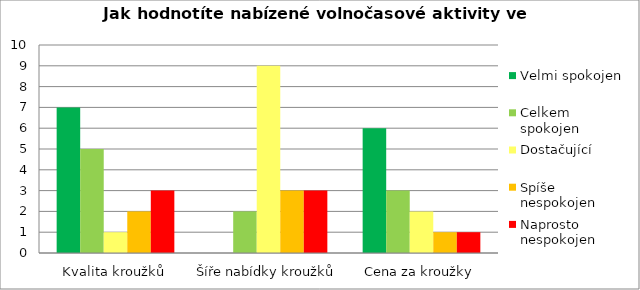
| Category | Velmi spokojen | Celkem 
spokojen | Dostačující | Spíše 
nespokojen | Naprosto 
nespokojen |
|---|---|---|---|---|---|
| Kvalita kroužků | 7 | 5 | 1 | 2 | 3 |
| Šíře nabídky kroužků | 0 | 2 | 9 | 3 | 3 |
| Cena za kroužky | 6 | 3 | 2 | 1 | 1 |